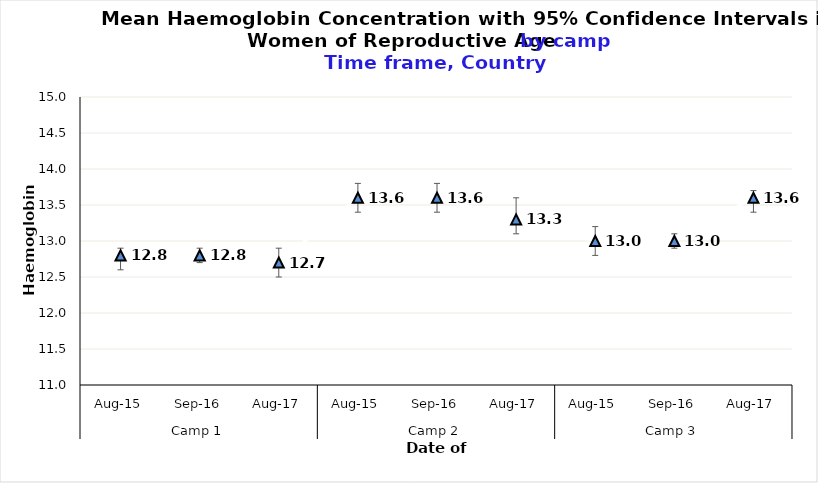
| Category | Mean HB |
|---|---|
| 0 | 12.8 |
| 1 | 12.8 |
| 2 | 12.7 |
| 3 | 13.6 |
| 4 | 13.6 |
| 5 | 13.3 |
| 6 | 13 |
| 7 | 13 |
| 8 | 13.6 |